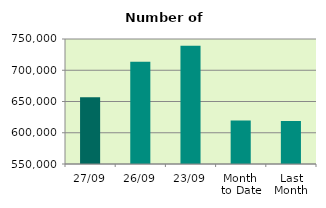
| Category | Series 0 |
|---|---|
| 27/09 | 656696 |
| 26/09 | 713548 |
| 23/09 | 739182 |
| Month 
to Date | 619498.211 |
| Last
Month | 618945.565 |